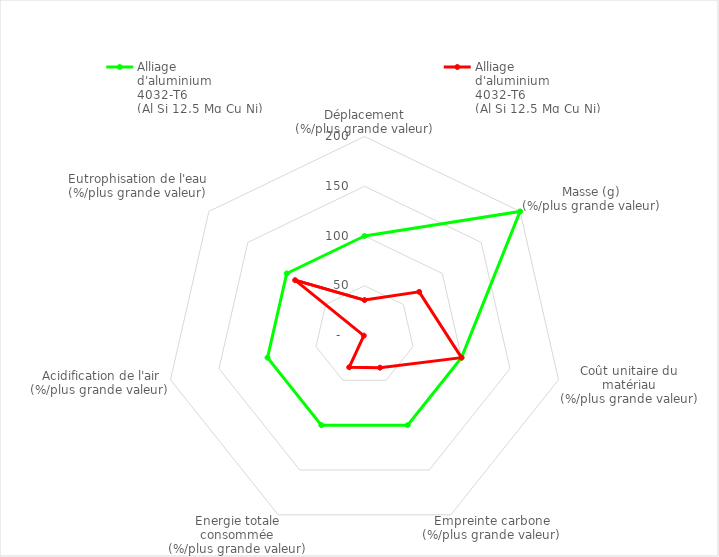
| Category | Alliage
d'aluminium
4032-T6
(Al Si 12,5 Mg Cu Ni)
Biellette initiale | Alliage
d'aluminium
4032-T6
(Al Si 12,5 Mg Cu Ni)
Biellette modifiée |
|---|---|---|
| Déplacement
(%/plus grande valeur) | 100 | 35.598 |
| Masse (g)
(%/plus grande valeur) | 200 | 70.306 |
| Coût unitaire du matériau
(%/plus grande valeur) | 100 | 100 |
| Empreinte carbone
(%/plus grande valeur) | 100 | 35.897 |
| Energie totale consommée
(%/plus grande valeur) | 100 | 35.417 |
|  Acidification de l'air
(%/plus grande valeur) | 100 | 0.715 |
| Eutrophisation de l'eau
(%/plus grande valeur) | 100 | 89.189 |